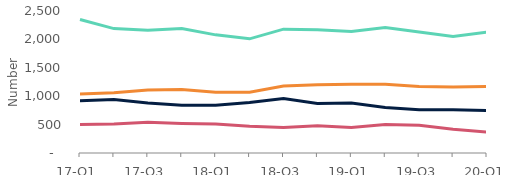
| Category | Arrears of 2.5%-5% of balance | Arrears of 5%-7.5% of balance | Arrears of 7.5%-10% of balance | Arrears over 10% of balance |
|---|---|---|---|---|
| 17-Q1 | 2350 | 920 | 500 | 1040 |
| 17-Q2 | 2190 | 940 | 510 | 1060 |
| 17-Q3 | 2160 | 880 | 540 | 1110 |
| 17-Q4 | 2190 | 840 | 520 | 1120 |
| 18-Q1 | 2080 | 840 | 510 | 1070 |
| 18-Q2 | 2010 | 890 | 470 | 1070 |
| 18-Q3 | 2180 | 960 | 450 | 1180 |
| 18-Q4 | 2170 | 870 | 480 | 1200 |
| 19-Q1 | 2140 | 880 | 450 | 1210 |
| 19-Q2 | 2210 | 800 | 500 | 1210 |
| 19-Q3 | 2130 | 760 | 490 | 1170 |
| 19-Q4 | 2050 | 760 | 420 | 1160 |
| 20-Q1 | 2130 | 750 | 370 | 1170 |